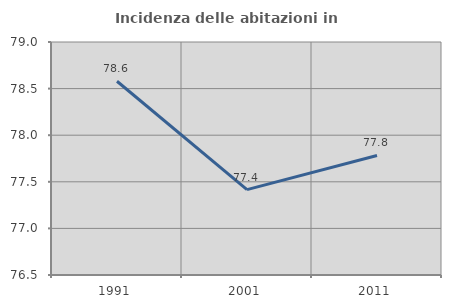
| Category | Incidenza delle abitazioni in proprietà  |
|---|---|
| 1991.0 | 78.579 |
| 2001.0 | 77.416 |
| 2011.0 | 77.782 |